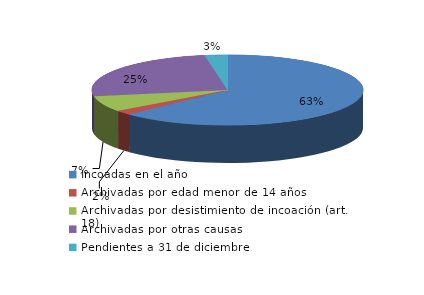
| Category | Series 0 |
|---|---|
| Incoadas en el año | 1045 |
| Archivadas por edad menor de 14 años | 34 |
| Archivadas por desistimiento de incoación (art. 18) | 121 |
| Archivadas por otras causas | 418 |
| Pendientes a 31 de diciembre | 45 |